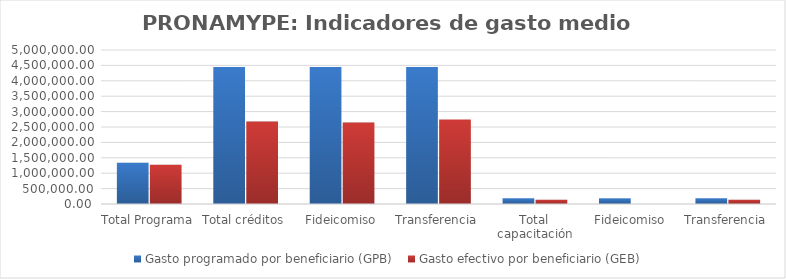
| Category | Gasto programado por beneficiario (GPB)  | Gasto efectivo por beneficiario (GEB)  |
|---|---|---|
| Total Programa | 1337837.838 | 1275434.832 |
| Total créditos | 4450000 | 2675900.241 |
| Fideicomiso | 4449838.188 | 2644585.423 |
| Transferencia | 4450261.78 | 2743685.366 |
| Total capacitación | 185185.185 | 138856.964 |
| Fideicomiso | 185185.185 | 0 |
| Transferencia | 185185.185 | 138856.964 |